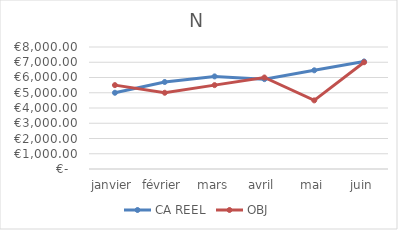
| Category | CA REEL | OBJ |
|---|---|---|
| janvier | 4999 | 5500 |
| février | 5705 | 5000 |
| mars | 6072 | 5500 |
| avril | 5893 | 6000 |
| mai | 6472 | 4500 |
| juin | 7052 | 7000 |